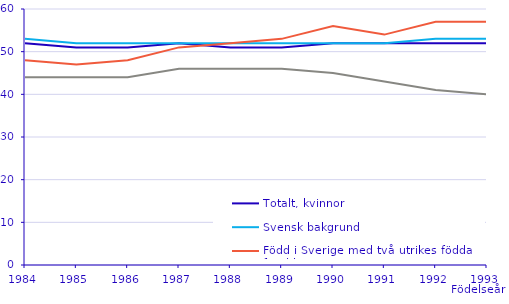
| Category | Totalt, kvinnor | Svensk bakgrund | Född i Sverige med två utrikes födda föräldrar | Utrikes född |
|---|---|---|---|---|
| 1984.0 | 52 | 53 | 48 | 44 |
| 1985.0 | 51 | 52 | 47 | 44 |
| 1986.0 | 51 | 52 | 48 | 44 |
| 1987.0 | 52 | 52 | 51 | 46 |
| 1988.0 | 51 | 52 | 52 | 46 |
| 1989.0 | 51 | 52 | 53 | 46 |
| 1990.0 | 52 | 52 | 56 | 45 |
| 1991.0 | 52 | 52 | 54 | 43 |
| 1992.0 | 52 | 53 | 57 | 41 |
| 1993.0 | 52 | 53 | 57 | 40 |